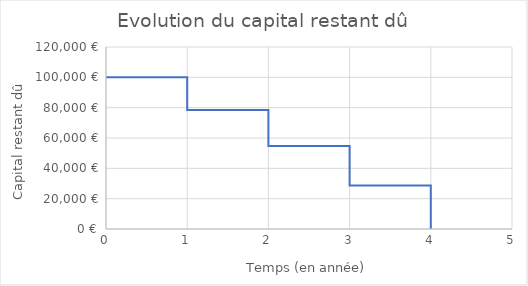
| Category | Series 0 |
|---|---|
| 0.0 | 100000 |
| 1.0 | 100000 |
| 1.0 | 78452.92 |
| 2.0 | 78452.92 |
| 2.0 | 54751.131 |
| 3.0 | 54751.131 |
| 3.0 | 28679.164 |
| 4.0 | 28679.164 |
| 4.0 | 0 |